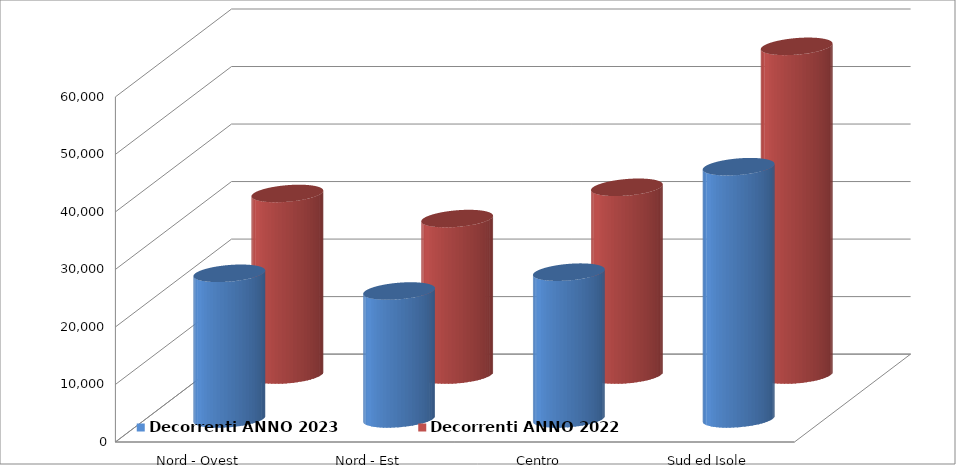
| Category | Decorrenti ANNO 2023 | Decorrenti ANNO 2022 |
|---|---|---|
| Nord - Ovest | 25325 | 31564 |
| Nord - Est | 22246 | 27200 |
| Centro | 25523 | 32638 |
| Sud ed Isole | 43858 | 57142 |